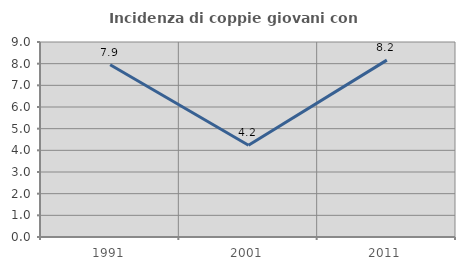
| Category | Incidenza di coppie giovani con figli |
|---|---|
| 1991.0 | 7.947 |
| 2001.0 | 4.237 |
| 2011.0 | 8.163 |